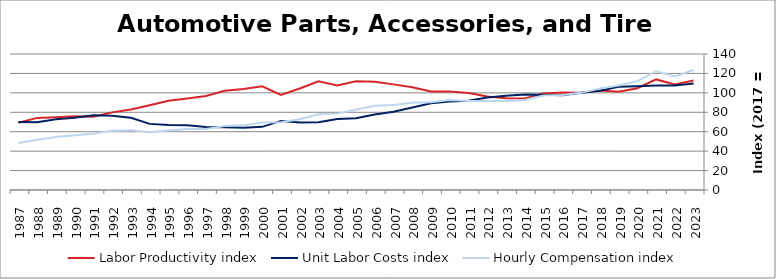
| Category | Labor Productivity index | Unit Labor Costs index | Hourly Compensation index |
|---|---|---|---|
| 2023.0 | 112.68 | 109.562 | 123.454 |
| 2022.0 | 108.718 | 107.612 | 116.994 |
| 2021.0 | 113.823 | 107.445 | 122.297 |
| 2020.0 | 104.819 | 106.878 | 112.028 |
| 2019.0 | 101.077 | 106.349 | 107.494 |
| 2018.0 | 102.325 | 102.181 | 104.557 |
| 2017.0 | 100 | 100 | 100 |
| 2016.0 | 100.335 | 97.576 | 97.903 |
| 2015.0 | 99.312 | 97.952 | 97.278 |
| 2014.0 | 94.125 | 98.327 | 92.55 |
| 2013.0 | 94.416 | 96.969 | 91.554 |
| 2012.0 | 96.27 | 95.216 | 91.665 |
| 2011.0 | 99.916 | 91.81 | 91.733 |
| 2010.0 | 101.497 | 91.168 | 92.532 |
| 2009.0 | 101.317 | 89.236 | 90.412 |
| 2008.0 | 105.696 | 85.027 | 89.871 |
| 2007.0 | 108.742 | 80.519 | 87.558 |
| 2006.0 | 111.482 | 77.8 | 86.734 |
| 2005.0 | 111.996 | 73.978 | 82.853 |
| 2004.0 | 107.586 | 73.077 | 78.62 |
| 2003.0 | 111.941 | 69.734 | 78.06 |
| 2002.0 | 104.55 | 69.613 | 72.78 |
| 2001.0 | 97.931 | 71.131 | 69.66 |
| 2000.0 | 106.732 | 65.004 | 69.38 |
| 1999.0 | 103.898 | 64.037 | 66.533 |
| 1998.0 | 102.127 | 64.576 | 65.95 |
| 1997.0 | 96.804 | 64.874 | 62.8 |
| 1996.0 | 94.27 | 66.676 | 62.856 |
| 1995.0 | 91.766 | 66.796 | 61.296 |
| 1994.0 | 87.277 | 68.069 | 59.409 |
| 1993.0 | 82.822 | 74.416 | 61.632 |
| 1992.0 | 79.911 | 76.485 | 61.12 |
| 1991.0 | 75.411 | 76.915 | 58.002 |
| 1990.0 | 75.838 | 74.353 | 56.387 |
| 1989.0 | 74.884 | 72.783 | 54.503 |
| 1988.0 | 74.232 | 69.75 | 51.777 |
| 1987.0 | 69.199 | 69.9 | 48.37 |